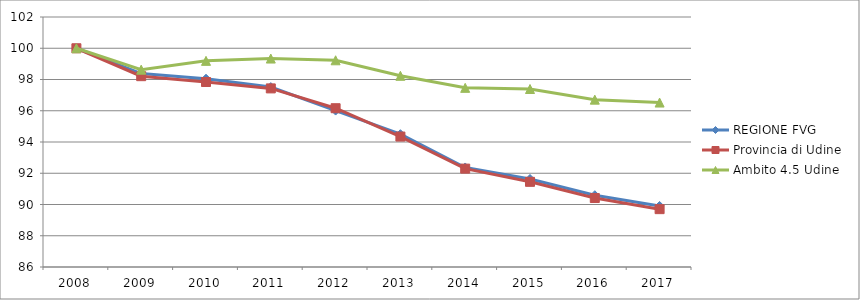
| Category | REGIONE FVG | Provincia di Udine | Ambito 4.5 Udine |
|---|---|---|---|
| 2008.0 | 100 | 100 | 100 |
| 2009.0 | 98.378 | 98.213 | 98.629 |
| 2010.0 | 98.049 | 97.839 | 99.192 |
| 2011.0 | 97.515 | 97.431 | 99.341 |
| 2012.0 | 96.012 | 96.162 | 99.229 |
| 2013.0 | 94.5 | 94.348 | 98.237 |
| 2014.0 | 92.37 | 92.296 | 97.466 |
| 2015.0 | 91.632 | 91.451 | 97.392 |
| 2016.0 | 90.595 | 90.414 | 96.71 |
| 2017.0 | 89.908 | 89.702 | 96.525 |